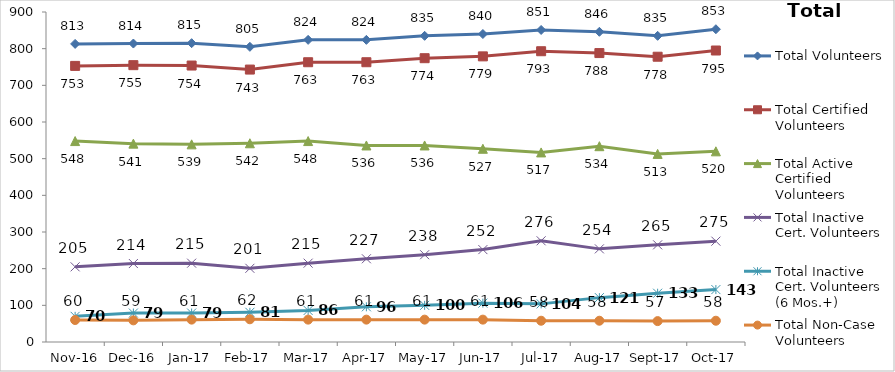
| Category | Total Volunteers | Total Certified Volunteers | Total Active Certified Volunteers | Total Inactive Cert. Volunteers | Total Inactive Cert. Volunteers (6 Mos.+) | Total Non-Case Volunteers |
|---|---|---|---|---|---|---|
| 2016-11-01 | 813 | 753 | 548 | 205 | 70 | 60 |
| 2016-12-01 | 814 | 755 | 541 | 214 | 79 | 59 |
| 2017-01-01 | 815 | 754 | 539 | 215 | 79 | 61 |
| 2017-02-01 | 805 | 743 | 542 | 201 | 81 | 62 |
| 2017-03-01 | 824 | 763 | 548 | 215 | 86 | 61 |
| 2017-04-01 | 824 | 763 | 536 | 227 | 96 | 61 |
| 2017-05-01 | 835 | 774 | 536 | 238 | 100 | 61 |
| 2017-06-01 | 840 | 779 | 527 | 252 | 106 | 61 |
| 2017-07-01 | 851 | 793 | 517 | 276 | 104 | 58 |
| 2017-08-01 | 846 | 788 | 534 | 254 | 121 | 58 |
| 2017-09-01 | 835 | 778 | 513 | 265 | 133 | 57 |
| 2017-10-01 | 853 | 795 | 520 | 275 | 143 | 58 |